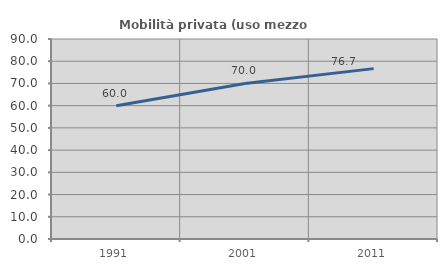
| Category | Mobilità privata (uso mezzo privato) |
|---|---|
| 1991.0 | 60 |
| 2001.0 | 70 |
| 2011.0 | 76.667 |